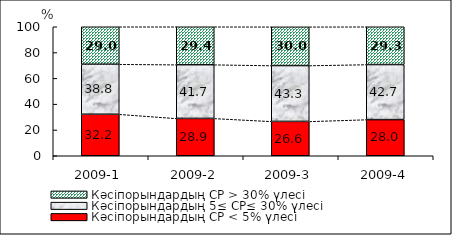
| Category | Кәсіпорындардың СР < 5% үлесі | Кәсіпорындардың 5≤ СР≤ 30% үлесі | Кәсіпорындардың СР > 30% үлесі |
|---|---|---|---|
| 2009-1 | 32.18 | 38.78 | 29.04 |
| 2009-2 | 28.94 | 41.66 | 29.4 |
| 2009-3 | 26.63 | 43.3 | 30.01 |
| 2009-4 | 28.04 | 42.67 | 29.29 |